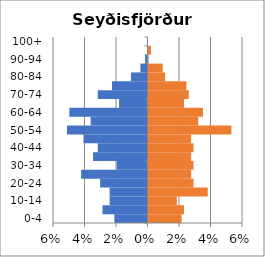
| Category | % Men | % Women |
|---|---|---|
| 0-4 | -0.021 | 0.021 |
| 5-9 | -0.029 | 0.023 |
| 10-14 | -0.024 | 0.018 |
| 15-19 | -0.024 | 0.038 |
| 20-24 | -0.03 | 0.029 |
| 25-29 | -0.042 | 0.027 |
| 30-34 | -0.02 | 0.029 |
| 35-39 | -0.035 | 0.027 |
| 40-44 | -0.032 | 0.029 |
| 45-49 | -0.041 | 0.027 |
| 50-54 | -0.051 | 0.053 |
| 55-59 | -0.036 | 0.032 |
| 60-64 | -0.05 | 0.035 |
| 65-69 | -0.018 | 0.023 |
| 70-74 | -0.032 | 0.026 |
| 75-79 | -0.023 | 0.024 |
| 80-84 | -0.011 | 0.011 |
| 85-89 | -0.005 | 0.009 |
| 90-94 | -0.002 | 0 |
| 95-99 | 0 | 0.002 |
| 100+ | 0 | 0 |